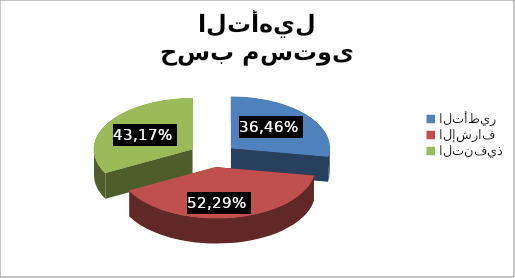
| Category | توزيع الموظفين حسب مستوى التأهيل |
|---|---|
| التأطير | 36.464 |
| الإشراف | 52.294 |
| التنفيذ | 43.169 |